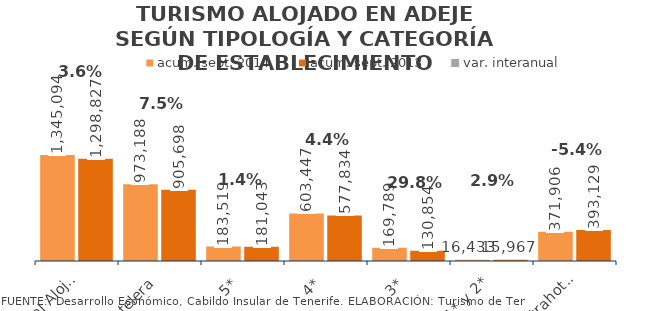
| Category | acum. sept. 2014 | acum. sept. 2013 |
|---|---|---|
| Total Alojados | 1345094 | 1298827 |
| Hotelera | 973188 | 905698 |
| 5* | 183519 | 181043 |
| 4* | 603447 | 577834 |
| 3* | 169789 | 130854 |
| 1* y 2* | 16433 | 15967 |
| Extrahotelera | 371906 | 393129 |